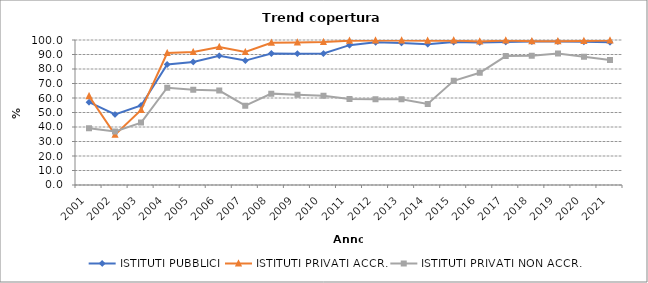
| Category | ISTITUTI PUBBLICI | ISTITUTI PRIVATI ACCR. | ISTITUTI PRIVATI NON ACCR. |
|---|---|---|---|
| 2001 | 57.111 | 61.275 | 39.216 |
| 2002 | 48.619 | 34.634 | 36.957 |
| 2003 | 54.849 | 51.763 | 43.023 |
| 2004 | 83.145 | 90.967 | 67.073 |
| 2005 | 84.904 | 91.68 | 65.753 |
| 2006 | 89.171 | 95.129 | 65.152 |
| 2007 | 85.796 | 91.706 | 54.667 |
| 2008 | 90.679 | 98.119 | 63.014 |
| 2009 | 90.584 | 98.259 | 62.319 |
| 2010 | 90.662 | 98.571 | 61.538 |
| 2011 | 96.454 | 99.519 | 59.375 |
| 2012 | 98.387 | 99.674 | 59.091 |
| 2013 | 97.954 | 99.673 | 59.091 |
| 2014 | 97.098 | 99.509 | 55.882 |
| 2015 | 98.545 | 99.671 | 71.875 |
| 2016 | 98.271 | 98.992 | 77.419 |
| 2017 | 98.623 | 99.662 | 88.889 |
| 2018 | 98.892 | 99.148 | 89.062 |
| 2019 | 98.886 | 99.147 | 90.769 |
| 2020 | 98.76 | 99.329 | 88.525 |
| 2021 | 98.468 | 99.662 | 86.154 |